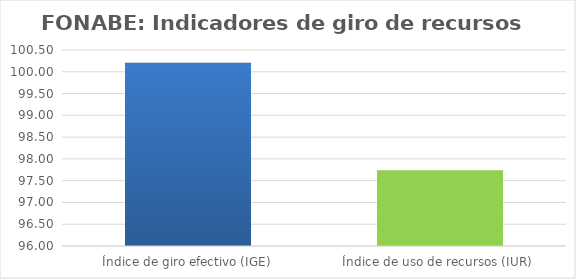
| Category | Series 0 |
|---|---|
| Índice de giro efectivo (IGE) | 100.206 |
| Índice de uso de recursos (IUR)  | 97.74 |